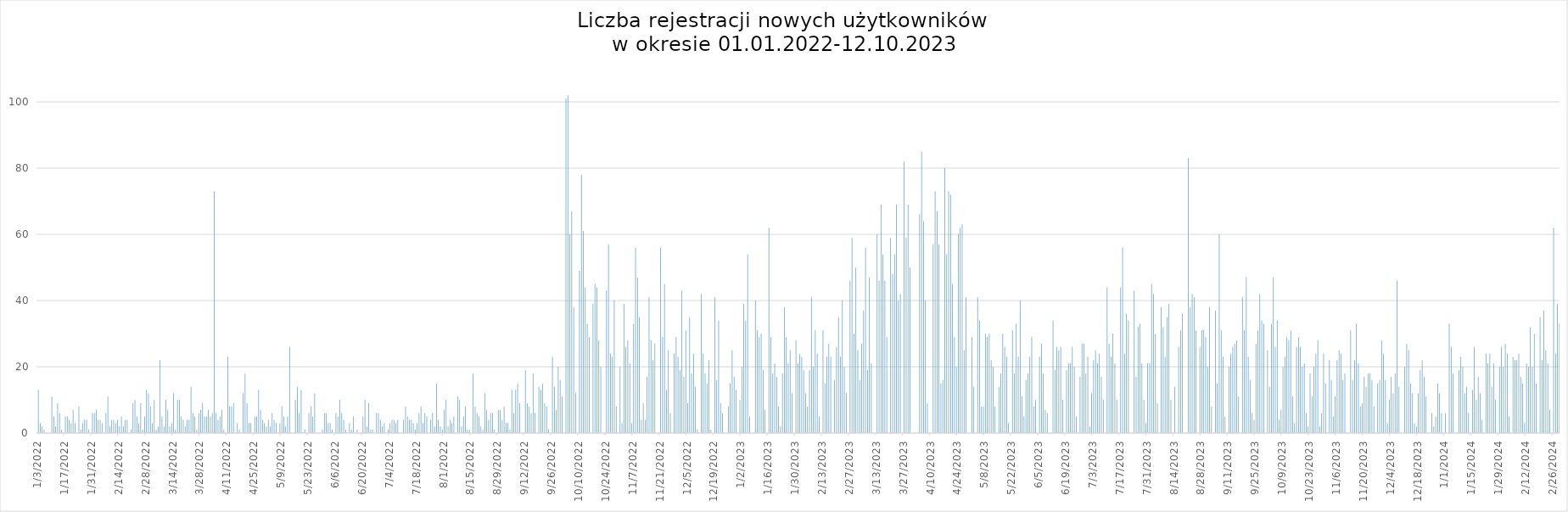
| Category | Dzienna liczba rejestracji |
|---|---|
| 1/3/22 | 13 |
| 1/4/22 | 3 |
| 1/5/22 | 2 |
| 1/6/22 | 1 |
| 1/10/22 | 11 |
| 1/11/22 | 5 |
| 1/12/22 | 2 |
| 1/13/22 | 9 |
| 1/14/22 | 6 |
| 1/15/22 | 1 |
| 1/17/22 | 5 |
| 1/18/22 | 5 |
| 1/19/22 | 4 |
| 1/20/22 | 3 |
| 1/21/22 | 7 |
| 1/22/22 | 3 |
| 1/24/22 | 8 |
| 1/25/22 | 1 |
| 1/26/22 | 3 |
| 1/27/22 | 4 |
| 1/28/22 | 4 |
| 1/29/22 | 1 |
| 1/31/22 | 6 |
| nan | 107 |
| 2/1/22 | 6 |
| 2/2/22 | 7 |
| 2/3/22 | 4 |
| 2/4/22 | 4 |
| 2/5/22 | 3 |
| 2/7/22 | 6 |
| 2/8/22 | 11 |
| 2/9/22 | 2 |
| 2/10/22 | 4 |
| 2/11/22 | 4 |
| 2/12/22 | 3 |
| 2/13/22 | 4 |
| 2/14/22 | 2 |
| 2/15/22 | 5 |
| 2/16/22 | 2 |
| 2/17/22 | 4 |
| 2/18/22 | 4 |
| 2/20/22 | 1 |
| 2/21/22 | 9 |
| 2/22/22 | 10 |
| 2/23/22 | 5 |
| 2/24/22 | 3 |
| 2/25/22 | 9 |
| 2/26/22 | 1 |
| 2/27/22 | 5 |
| 2/28/22 | 13 |
| nan | 131 |
| 3/1/22 | 12 |
| 3/2/22 | 8 |
| 3/3/22 | 3 |
| 3/4/22 | 10 |
| 3/5/22 | 1 |
| 3/6/22 | 2 |
| 3/7/22 | 22 |
| 3/8/22 | 5 |
| 3/9/22 | 2 |
| 3/10/22 | 10 |
| 3/11/22 | 7 |
| 3/12/22 | 2 |
| 3/13/22 | 3 |
| 3/14/22 | 12 |
| 3/15/22 | 1 |
| 3/16/22 | 10 |
| 3/17/22 | 10 |
| 3/18/22 | 5 |
| 3/19/22 | 4 |
| 3/20/22 | 2 |
| 3/21/22 | 4 |
| 3/22/22 | 4 |
| 3/23/22 | 14 |
| 3/24/22 | 6 |
| 3/25/22 | 5 |
| 3/26/22 | 1 |
| 3/27/22 | 6 |
| 3/28/22 | 7 |
| 3/29/22 | 9 |
| 3/30/22 | 5 |
| 3/31/22 | 5 |
| nan | 197 |
| 4/1/22 | 7 |
| 4/2/22 | 5 |
| 4/3/22 | 6 |
| 4/4/22 | 73 |
| 4/5/22 | 6 |
| 4/6/22 | 4 |
| 4/7/22 | 5 |
| 4/8/22 | 7 |
| 4/9/22 | 1 |
| 4/11/22 | 23 |
| 4/12/22 | 8 |
| 4/13/22 | 8 |
| 4/14/22 | 9 |
| 4/16/22 | 3 |
| 4/17/22 | 1 |
| 4/19/22 | 12 |
| 4/20/22 | 18 |
| 4/21/22 | 9 |
| 4/22/22 | 3 |
| 4/23/22 | 3 |
| 4/25/22 | 5 |
| 4/26/22 | 5 |
| 4/27/22 | 13 |
| 4/28/22 | 7 |
| 4/29/22 | 4 |
| 4/30/22 | 3 |
| nan | 248 |
| 5/1/22 | 2 |
| 5/2/22 | 4 |
| 5/3/22 | 2 |
| 5/4/22 | 6 |
| 5/5/22 | 4 |
| 5/6/22 | 3 |
| 5/8/22 | 3 |
| 5/9/22 | 8 |
| 5/10/22 | 5 |
| 5/11/22 | 2 |
| 5/12/22 | 5 |
| 5/13/22 | 26 |
| 5/16/22 | 10 |
| 5/17/22 | 14 |
| 5/18/22 | 6 |
| 5/19/22 | 13 |
| 5/21/22 | 1 |
| 5/23/22 | 6 |
| 5/24/22 | 8 |
| 5/25/22 | 5 |
| 5/26/22 | 12 |
| 5/30/22 | 1 |
| 5/31/22 | 6 |
| nan | 152 |
| 6/1/22 | 6 |
| 6/2/22 | 3 |
| 6/3/22 | 3 |
| 6/4/22 | 1 |
| 6/6/22 | 6 |
| 6/7/22 | 5 |
| 6/8/22 | 10 |
| 6/9/22 | 6 |
| 6/10/22 | 4 |
| 6/11/22 | 1 |
| 6/13/22 | 3 |
| 6/14/22 | 1 |
| 6/15/22 | 5 |
| 6/17/22 | 1 |
| 6/20/22 | 5 |
| 6/21/22 | 10 |
| 6/22/22 | 2 |
| 6/23/22 | 9 |
| 6/24/22 | 1 |
| 6/25/22 | 1 |
| 6/27/22 | 6 |
| 6/28/22 | 6 |
| 6/29/22 | 4 |
| 6/30/22 | 2 |
| nan | 101 |
| 7/1/22 | 3 |
| 7/3/22 | 1 |
| 7/4/22 | 3 |
| 7/5/22 | 4 |
| 7/6/22 | 4 |
| 7/7/22 | 3 |
| 7/8/22 | 4 |
| 7/11/22 | 4 |
| 7/12/22 | 8 |
| 7/13/22 | 5 |
| 7/14/22 | 4 |
| 7/15/22 | 4 |
| 7/16/22 | 3 |
| 7/17/22 | 1 |
| 7/18/22 | 3 |
| 7/19/22 | 6 |
| 7/20/22 | 8 |
| 7/21/22 | 3 |
| 7/22/22 | 6 |
| 7/23/22 | 5 |
| 7/25/22 | 4 |
| 7/26/22 | 6 |
| 7/27/22 | 2 |
| 7/28/22 | 15 |
| 7/29/22 | 4 |
| 7/30/22 | 2 |
| 7/31/22 | 1 |
| nan | 116 |
| 8/1/22 | 7 |
| 8/2/22 | 10 |
| 8/3/22 | 2 |
| 8/4/22 | 4 |
| 8/5/22 | 3 |
| 8/6/22 | 5 |
| 8/8/22 | 11 |
| 8/9/22 | 10 |
| 8/10/22 | 2 |
| 8/11/22 | 5 |
| 8/12/22 | 8 |
| 8/13/22 | 1 |
| 8/14/22 | 1 |
| 8/16/22 | 18 |
| 8/17/22 | 8 |
| 8/18/22 | 6 |
| 8/19/22 | 5 |
| 8/20/22 | 2 |
| 8/21/22 | 1 |
| 8/22/22 | 12 |
| 8/23/22 | 7 |
| 8/24/22 | 4 |
| 8/25/22 | 6 |
| 8/26/22 | 6 |
| 8/27/22 | 1 |
| 8/29/22 | 7 |
| 8/30/22 | 7 |
| 8/31/22 | 4 |
| nan | 163 |
| 9/1/22 | 8 |
| 9/2/22 | 3 |
| 9/3/22 | 3 |
| 9/4/22 | 1 |
| 9/5/22 | 13 |
| 9/6/22 | 6 |
| 9/7/22 | 13 |
| 9/8/22 | 15 |
| 9/9/22 | 9 |
| 9/12/22 | 19 |
| 9/13/22 | 9 |
| 9/14/22 | 8 |
| 9/15/22 | 6 |
| 9/16/22 | 18 |
| 9/17/22 | 6 |
| 9/19/22 | 14 |
| 9/20/22 | 13 |
| 9/21/22 | 15 |
| 9/22/22 | 9 |
| 9/23/22 | 8 |
| 9/24/22 | 1 |
| 9/26/22 | 23 |
| 9/27/22 | 14 |
| 9/28/22 | 7 |
| 9/29/22 | 20 |
| 9/30/22 | 16 |
| nan | 277 |
| 10/1/22 | 11 |
| 10/3/22 | 101 |
| 10/4/22 | 102 |
| 10/5/22 | 60 |
| 10/6/22 | 67 |
| 10/7/22 | 38 |
| 10/8/22 | 12 |
| 10/10/22 | 49 |
| 10/11/22 | 78 |
| 10/12/22 | 61 |
| 10/13/22 | 44 |
| 10/14/22 | 33 |
| 10/15/22 | 29 |
| 10/17/22 | 39 |
| 10/18/22 | 45 |
| 10/19/22 | 44 |
| 10/20/22 | 28 |
| 10/21/22 | 20 |
| 10/24/22 | 43 |
| 10/25/22 | 57 |
| 10/26/22 | 24 |
| 10/27/22 | 23 |
| 10/28/22 | 40 |
| 10/29/22 | 8 |
| 10/31/22 | 20 |
| nan | 1076 |
| 11/1/22 | 3 |
| 11/2/22 | 39 |
| 11/3/22 | 26 |
| 11/4/22 | 28 |
| 11/5/22 | 21 |
| 11/6/22 | 3 |
| 11/7/22 | 33 |
| 11/8/22 | 56 |
| 11/9/22 | 47 |
| 11/10/22 | 35 |
| 11/11/22 | 4 |
| 11/12/22 | 9 |
| 11/13/22 | 4 |
| 11/14/22 | 17 |
| 11/15/22 | 41 |
| 11/16/22 | 28 |
| 11/17/22 | 22 |
| 11/18/22 | 27 |
| 11/21/22 | 56 |
| 11/22/22 | 29 |
| 11/23/22 | 45 |
| 11/24/22 | 13 |
| 11/25/22 | 25 |
| 11/26/22 | 6 |
| 11/28/22 | 24 |
| 11/29/22 | 29 |
| 11/30/22 | 23 |
| nan | 693 |
| 12/1/22 | 19 |
| 12/2/22 | 43 |
| 12/3/22 | 17 |
| 12/4/22 | 31 |
| 12/5/22 | 9 |
| 12/6/22 | 35 |
| 12/7/22 | 18 |
| 12/8/22 | 24 |
| 12/9/22 | 14 |
| 12/10/22 | 1 |
| 12/12/22 | 42 |
| 12/13/22 | 24 |
| 12/14/22 | 18 |
| 12/15/22 | 15 |
| 12/16/22 | 22 |
| 12/17/22 | 1 |
| 12/19/22 | 41 |
| 12/20/22 | 16 |
| 12/21/22 | 34 |
| 12/22/22 | 9 |
| 12/23/22 | 6 |
| 12/26/22 | 8 |
| 12/27/22 | 15 |
| 12/28/22 | 25 |
| 12/29/22 | 17 |
| 12/30/22 | 13 |
| nan | 517 |
| 1/1/23 | 10 |
| 1/2/23 | 20 |
| 1/3/23 | 39 |
| 1/4/23 | 34 |
| 1/5/23 | 54 |
| 1/6/23 | 5 |
| 1/9/23 | 40 |
| 1/10/23 | 31 |
| 1/11/23 | 29 |
| 1/12/23 | 30 |
| 1/13/23 | 19 |
| 1/14/23 | 7 |
| 1/16/23 | 62 |
| 1/17/23 | 29 |
| 1/18/23 | 18 |
| 1/19/23 | 21 |
| 1/20/23 | 17 |
| 1/21/23 | 8 |
| 1/22/23 | 2 |
| 1/23/23 | 18 |
| 1/24/23 | 38 |
| 1/25/23 | 29 |
| 1/26/23 | 21 |
| 1/27/23 | 25 |
| 1/28/23 | 12 |
| 1/30/23 | 28 |
| 1/31/23 | 21 |
| nan | 667 |
| 2/1/23 | 24 |
| 2/2/23 | 23 |
| 2/3/23 | 19 |
| 2/4/23 | 12 |
| 2/5/23 | 8 |
| 2/6/23 | 19 |
| 2/7/23 | 41 |
| 2/8/23 | 20 |
| 2/9/23 | 31 |
| 2/10/23 | 24 |
| 2/11/23 | 5 |
| 2/13/23 | 31 |
| 2/14/23 | 15 |
| 2/15/23 | 23 |
| 2/16/23 | 27 |
| 2/17/23 | 23 |
| 2/19/23 | 16 |
| 2/20/23 | 26 |
| 2/21/23 | 35 |
| 2/22/23 | 23 |
| 2/23/23 | 40 |
| 2/24/23 | 20 |
| 2/25/23 | 12 |
| 2/27/23 | 46 |
| 2/28/23 | 59 |
| nan | 622 |
| 3/1/23 | 30 |
| 3/2/23 | 50 |
| 3/3/23 | 25 |
| 3/4/23 | 16 |
| 3/5/23 | 27 |
| 3/6/23 | 37 |
| 3/7/23 | 56 |
| 3/8/23 | 19 |
| 3/9/23 | 47 |
| 3/10/23 | 21 |
| 3/13/23 | 60 |
| 3/14/23 | 46 |
| 3/15/23 | 69 |
| 3/16/23 | 54 |
| 3/17/23 | 46 |
| 3/18/23 | 29 |
| 3/20/23 | 59 |
| 3/21/23 | 48 |
| 3/22/23 | 54 |
| 3/23/23 | 69 |
| 3/24/23 | 40 |
| 3/25/23 | 42 |
| 3/27/23 | 82 |
| 3/28/23 | 59 |
| 3/29/23 | 69 |
| 3/30/23 | 50 |
| nan | 1204 |
| 4/4/23 | 66 |
| 4/5/23 | 85 |
| 4/6/23 | 64 |
| 4/7/23 | 40 |
| 4/8/23 | 9 |
| 4/11/23 | 57 |
| 4/12/23 | 73 |
| 4/13/23 | 67 |
| 4/14/23 | 57 |
| 4/15/23 | 15 |
| 4/16/23 | 16 |
| 4/17/23 | 80 |
| 4/18/23 | 54 |
| 4/19/23 | 73 |
| 4/20/23 | 72 |
| 4/21/23 | 45 |
| 4/22/23 | 29 |
| 4/23/23 | 20 |
| 4/24/23 | 60 |
| 4/25/23 | 62 |
| 4/26/23 | 63 |
| 4/27/23 | 25 |
| 4/28/23 | 41 |
| 4/29/23 | 0 |
| 4/30/23 | 0 |
| nan | 1173 |
| 5/1/23 | 29 |
| 5/2/23 | 14 |
| 5/4/23 | 41 |
| 5/5/23 | 34 |
| 5/6/23 | 8 |
| 5/7/23 | 8 |
| 5/8/23 | 30 |
| 5/9/23 | 29 |
| 5/10/23 | 30 |
| 5/11/23 | 22 |
| 5/12/23 | 20 |
| 5/13/23 | 8 |
| 5/15/23 | 14 |
| 5/16/23 | 18 |
| 5/17/23 | 30 |
| 5/18/23 | 26 |
| 5/19/23 | 23 |
| 5/20/23 | 3 |
| 5/22/23 | 31 |
| 5/23/23 | 18 |
| 5/24/23 | 33 |
| 5/25/23 | 23 |
| 5/26/23 | 40 |
| 5/27/23 | 11 |
| 5/28/23 | 5 |
| 5/29/23 | 16 |
| 5/30/23 | 18 |
| 5/31/23 | 23 |
| nan | 605 |
| 6/1/23 | 29 |
| 6/2/23 | 8 |
| 6/3/23 | 10 |
| 6/5/23 | 23 |
| 6/6/23 | 27 |
| 6/7/23 | 18 |
| 6/8/23 | 7 |
| 6/9/23 | 6 |
| 6/12/23 | 34 |
| 6/13/23 | 19 |
| 6/14/23 | 26 |
| 6/15/23 | 25 |
| 6/16/23 | 26 |
| 6/17/23 | 10 |
| 6/19/23 | 19 |
| 6/20/23 | 21 |
| 6/21/23 | 21 |
| 6/22/23 | 26 |
| 6/23/23 | 20 |
| 6/24/23 | 5 |
| 6/26/23 | 17 |
| 6/27/23 | 27 |
| 6/28/23 | 27 |
| 6/29/23 | 18 |
| 6/30/23 | 23 |
| nan | 492 |
| 7/1/23 | 2 |
| 7/2/23 | 12 |
| 7/3/23 | 22 |
| 7/4/23 | 25 |
| 7/5/23 | 21 |
| 7/6/23 | 24 |
| 7/7/23 | 17 |
| 7/8/23 | 10 |
| 7/10/23 | 44 |
| 7/11/23 | 27 |
| 7/12/23 | 23 |
| 7/13/23 | 30 |
| 7/14/23 | 21 |
| 7/15/23 | 10 |
| 7/17/23 | 44 |
| 7/18/23 | 56 |
| 7/19/23 | 24 |
| 7/20/23 | 36 |
| 7/21/23 | 34 |
| 7/24/23 | 43 |
| 7/25/23 | 17 |
| 7/26/23 | 32 |
| 7/27/23 | 33 |
| 7/28/23 | 21 |
| 7/29/23 | 10 |
| 7/30/23 | 3 |
| 7/31/23 | 21 |
| nan | 662 |
| 8/1/23 | 21 |
| 8/2/23 | 45 |
| 8/3/23 | 42 |
| 8/4/23 | 30 |
| 8/5/23 | 9 |
| 8/7/23 | 38 |
| 8/8/23 | 32 |
| 8/9/23 | 23 |
| 8/10/23 | 35 |
| 8/11/23 | 39 |
| 8/12/23 | 10 |
| 8/14/23 | 14 |
| 8/16/23 | 26 |
| 8/17/23 | 31 |
| 8/18/23 | 36 |
| 8/21/23 | 83 |
| 8/22/23 | 38 |
| 8/23/23 | 42 |
| 8/24/23 | 41 |
| 8/25/23 | 31 |
| 8/27/23 | 26 |
| 8/28/23 | 31 |
| 8/29/23 | 31 |
| 8/30/23 | 29 |
| 8/31/23 | 20 |
| nan | 803 |
| 9/1/23 | 38 |
| 9/2/23 | 8 |
| 9/4/23 | 37 |
| 9/5/23 | 15 |
| 9/6/23 | 60 |
| 9/7/23 | 31 |
| 9/8/23 | 23 |
| 9/9/23 | 5 |
| 9/11/23 | 20 |
| 9/12/23 | 24 |
| 9/13/23 | 26 |
| 9/14/23 | 27 |
| 9/15/23 | 28 |
| 9/16/23 | 11 |
| 9/18/23 | 41 |
| 9/19/23 | 31 |
| 9/20/23 | 47 |
| 9/21/23 | 23 |
| 9/22/23 | 16 |
| 9/23/23 | 6 |
| 9/24/23 | 4 |
| 9/25/23 | 27 |
| 9/26/23 | 31 |
| 9/27/23 | 42 |
| 9/28/23 | 34 |
| 9/29/23 | 33 |
| nan | 688 |
| 10/1/23 | 25 |
| 10/2/23 | 14 |
| 10/3/23 | 33 |
| 10/4/23 | 47 |
| 10/5/23 | 26 |
| 10/6/23 | 34 |
| 10/7/23 | 4 |
| 10/8/23 | 7 |
| 10/9/23 | 20 |
| 10/10/23 | 23 |
| 10/11/23 | 29 |
| 10/12/23 | 28 |
| 10/13/23 | 31 |
| 10/14/23 | 11 |
| 10/15/23 | 3 |
| 10/16/23 | 26 |
| 10/17/23 | 29 |
| 10/18/23 | 26 |
| 10/19/23 | 20 |
| 10/20/23 | 21 |
| 10/21/23 | 6 |
| 10/22/23 | 2 |
| 10/23/23 | 18 |
| 10/24/23 | 11 |
| 10/25/23 | 20 |
| 10/26/23 | 24 |
| 10/27/23 | 28 |
| 10/28/23 | 2 |
| 10/29/23 | 6 |
| 10/30/23 | 24 |
| 10/31/23 | 15 |
| 11/2/23 | 22 |
| 11/3/23 | 16 |
| 11/4/23 | 5 |
| 11/5/23 | 11 |
| 11/6/23 | 22 |
| 11/7/23 | 25 |
| 11/8/23 | 24 |
| 11/9/23 | 16 |
| 11/10/23 | 18 |
| 11/13/23 | 31 |
| 11/14/23 | 16 |
| 11/15/23 | 22 |
| 11/16/23 | 33 |
| 11/17/23 | 21 |
| 11/18/23 | 8 |
| 11/19/23 | 9 |
| 11/20/23 | 17 |
| 11/21/23 | 14 |
| 11/22/23 | 18 |
| 11/23/23 | 18 |
| 11/24/23 | 16 |
| 11/25/23 | 8 |
| 11/27/23 | 15 |
| 11/28/23 | 16 |
| 11/29/23 | 28 |
| 11/30/23 | 24 |
| 12/1/23 | 16 |
| 12/2/23 | 3 |
| 12/3/23 | 10 |
| 12/4/23 | 17 |
| 12/5/23 | 12 |
| 12/6/23 | 18 |
| 12/7/23 | 46 |
| 12/8/23 | 14 |
| 12/11/23 | 20 |
| 12/12/23 | 27 |
| 12/13/23 | 25 |
| 12/14/23 | 15 |
| 12/15/23 | 12 |
| 12/16/23 | 3 |
| 12/17/23 | 2 |
| 12/18/23 | 12 |
| 12/19/23 | 19 |
| 12/20/23 | 22 |
| 12/21/23 | 17 |
| 12/22/23 | 11 |
| 12/25/23 | 6 |
| 12/26/23 | 2 |
| 12/27/23 | 5 |
| 12/28/23 | 15 |
| 12/29/23 | 12 |
| 12/30/23 | 6 |
| 1/1/24 | 6 |
| 1/3/24 | 33 |
| 1/4/24 | 26 |
| 1/5/24 | 18 |
| 1/8/24 | 19 |
| 1/9/24 | 23 |
| 1/10/24 | 20 |
| 1/11/24 | 12 |
| 1/12/24 | 14 |
| 1/13/24 | 6 |
| 1/15/24 | 13 |
| 1/16/24 | 26 |
| 1/17/24 | 10 |
| 1/18/24 | 17 |
| 1/19/24 | 12 |
| 1/20/24 | 4 |
| 1/22/24 | 24 |
| 1/23/24 | 21 |
| 1/24/24 | 24 |
| 1/25/24 | 14 |
| 1/26/24 | 21 |
| 1/27/24 | 10 |
| 1/29/24 | 20 |
| 1/30/24 | 26 |
| 1/31/24 | 20 |
| 2/1/24 | 27 |
| 2/2/24 | 24 |
| 2/3/24 | 5 |
| 2/5/24 | 23 |
| 2/6/24 | 22 |
| 2/7/24 | 22 |
| 2/8/24 | 24 |
| 2/9/24 | 17 |
| 2/10/24 | 15 |
| 2/11/24 | 3 |
| 2/12/24 | 21 |
| 2/13/24 | 20 |
| 2/14/24 | 32 |
| 2/15/24 | 20 |
| 2/16/24 | 30 |
| 2/17/24 | 15 |
| 2/19/24 | 35 |
| 2/20/24 | 22 |
| 2/21/24 | 37 |
| 2/22/24 | 25 |
| 2/23/24 | 21 |
| 2/24/24 | 7 |
| 2/26/24 | 62 |
| 2/27/24 | 24 |
| 2/28/24 | 39 |
| 2/29/24 | 33 |